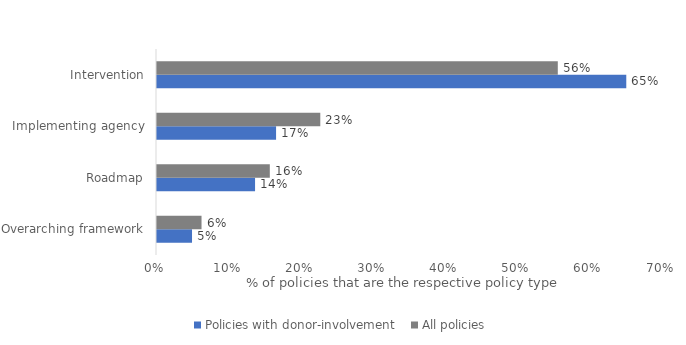
| Category | Policies with donor-involvement  | All policies |
|---|---|---|
| Overarching framework | 0.049 | 0.062 |
| Roadmap | 0.136 | 0.156 |
| Implementing agency | 0.165 | 0.226 |
| Intervention | 0.65 | 0.556 |